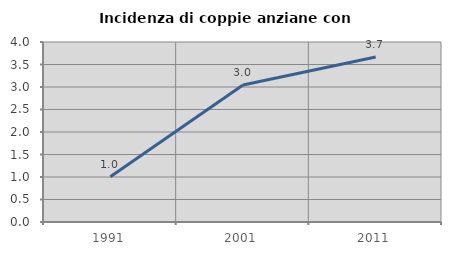
| Category | Incidenza di coppie anziane con figli |
|---|---|
| 1991.0 | 1.005 |
| 2001.0 | 3.046 |
| 2011.0 | 3.665 |